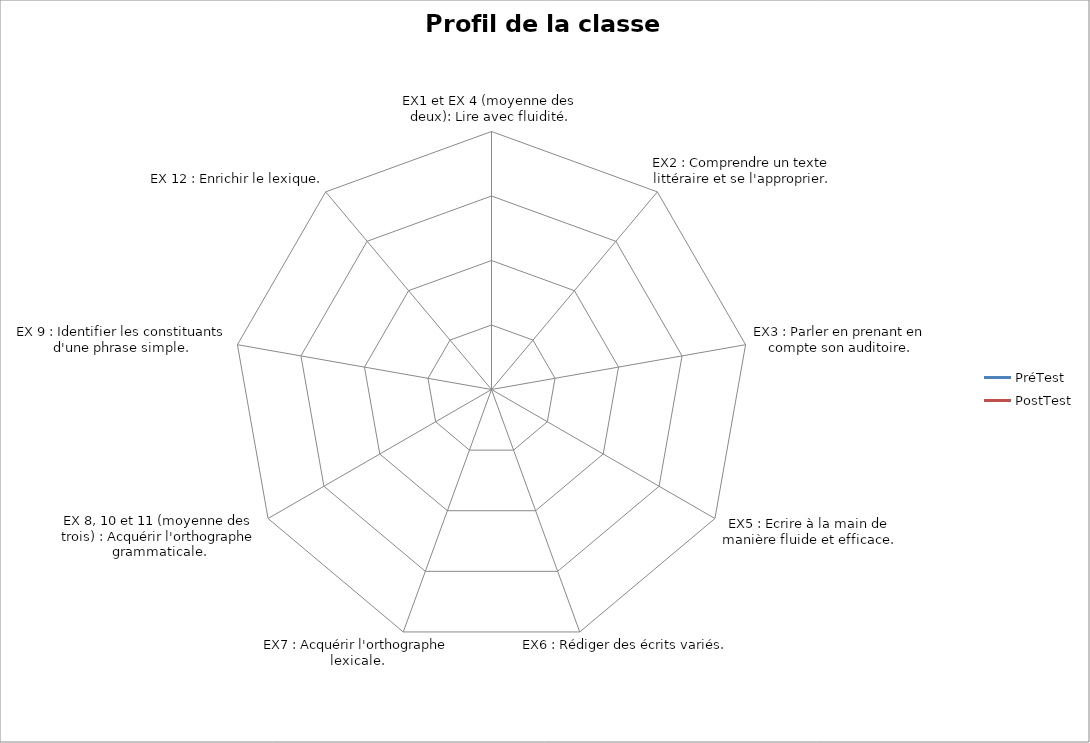
| Category | PréTest | PostTest |
|---|---|---|
| EX1 et EX 4 (moyenne des deux): Lire avec fluidité. | 0 | 0 |
| EX2 : Comprendre un texte littéraire et se l'approprier. | 0 | 0 |
| EX3 : Parler en prenant en compte son auditoire. | 0 | 0 |
| EX5 : Ecrire à la main de manière fluide et efficace. | 0 | 0 |
| EX6 : Rédiger des écrits variés. | 0 | 0 |
| EX7 : Acquérir l'orthographe lexicale. | 0 | 0 |
| EX 8, 10 et 11 (moyenne des trois) : Acquérir l'orthographe grammaticale. | 0 | 0 |
| EX 9 : Identifier les constituants d'une phrase simple. | 0 | 0 |
| EX 12 : Enrichir le lexique. | 0 | 0 |